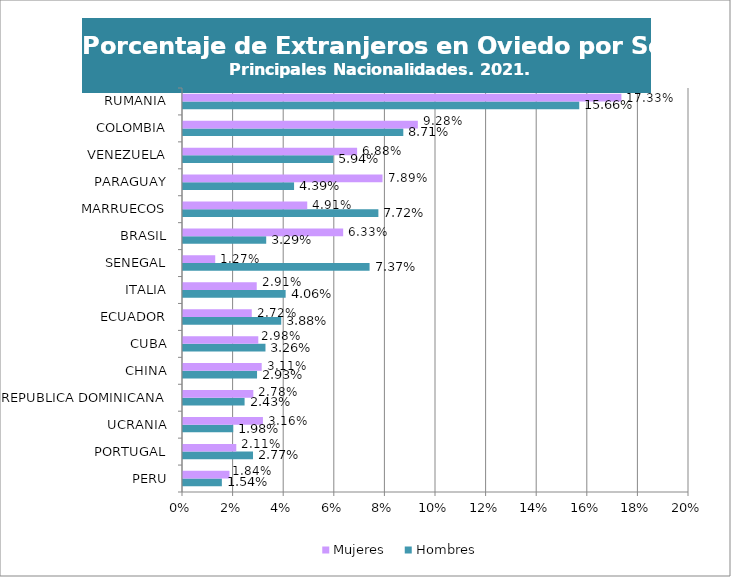
| Category | Hombres | Mujeres |
|---|---|---|
| PERU | 0.015 | 0.018 |
| PORTUGAL | 0.028 | 0.021 |
| UCRANIA | 0.02 | 0.032 |
| REPUBLICA DOMINICANA | 0.024 | 0.028 |
| CHINA | 0.029 | 0.031 |
| CUBA | 0.033 | 0.03 |
| ECUADOR | 0.039 | 0.027 |
| ITALIA | 0.041 | 0.029 |
| SENEGAL | 0.074 | 0.013 |
| BRASIL | 0.033 | 0.063 |
| MARRUECOS | 0.077 | 0.049 |
| PARAGUAY | 0.044 | 0.079 |
| VENEZUELA | 0.059 | 0.069 |
| COLOMBIA | 0.087 | 0.093 |
| RUMANIA | 0.157 | 0.173 |